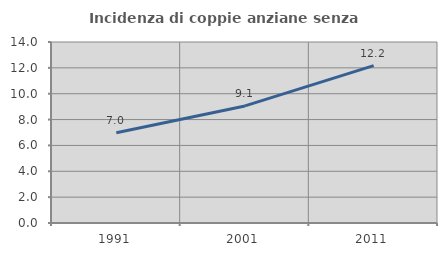
| Category | Incidenza di coppie anziane senza figli  |
|---|---|
| 1991.0 | 6.978 |
| 2001.0 | 9.055 |
| 2011.0 | 12.168 |